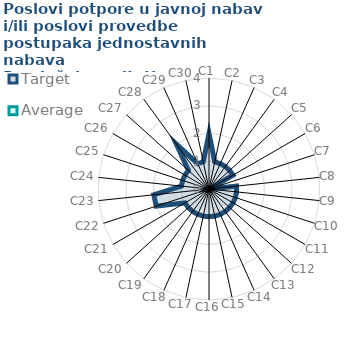
| Category | Target | Average |
|---|---|---|
| C1 | 2 | 0 |
| C2 | 1 | 0 |
| C3 | 1 | 0 |
| C4 | 1 | 0 |
| C5 | 1 | 0 |
| C6 | 1 | 0 |
| C7 | 0 | 0 |
| C8 | 1 | 0 |
| C9 | 1 | 0 |
| C10 | 1 | 0 |
| C11 | 1 | 0 |
| C12 | 1 | 0 |
| C13 | 1 | 0 |
| C14 | 1 | 0 |
| C15 | 1 | 0 |
| C16 | 1 | 0 |
| C17 | 1 | 0 |
| C18 | 1 | 0 |
| C19 | 1 | 0 |
| C20 | 1 | 0 |
| C21 | 1 | 0 |
| C22 | 2 | 0 |
| C23 | 2 | 0 |
| C24 | 1 | 0 |
| C25 | 1 | 0 |
| C26 | 1 | 0 |
| C27 | 1 | 0 |
| C28 | 2 | 0 |
| C29 | 1 | 0 |
| C30 | 1 | 0 |